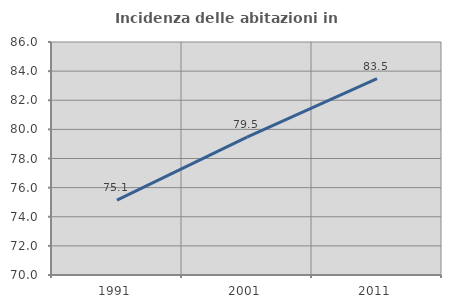
| Category | Incidenza delle abitazioni in proprietà  |
|---|---|
| 1991.0 | 75.144 |
| 2001.0 | 79.472 |
| 2011.0 | 83.484 |